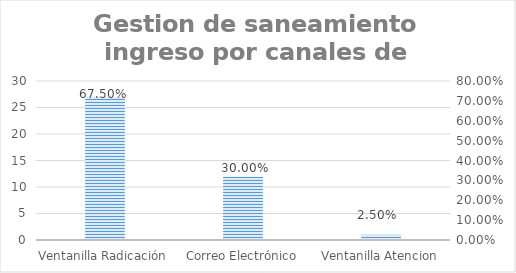
| Category | Series 0 |
|---|---|
| Ventanilla Radicación | 27 |
| Correo Electrónico | 12 |
| Ventanilla Atencion | 1 |